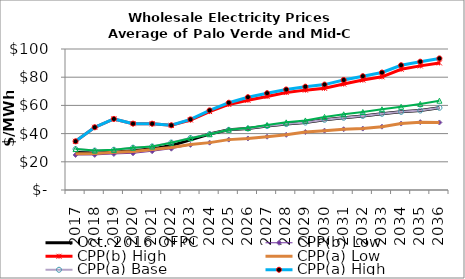
| Category | Oct. 2016 OFPC | CPP(b) Low | CPP(b) High | CPP(a) Low | CPP(a) Base | CPP(a) High | CO2 Price |
|---|---|---|---|---|---|---|---|
| 2017.0 | 26.578 | 24.853 | 34.522 | 25.743 | 29.017 | 34.522 | 29.017 |
| 2018.0 | 26.179 | 24.899 | 44.488 | 25.886 | 27.981 | 44.488 | 27.981 |
| 2019.0 | 26.905 | 25.584 | 50.384 | 26.852 | 28.545 | 50.409 | 28.501 |
| 2020.0 | 27.868 | 26.037 | 47.05 | 27.334 | 30.026 | 47.07 | 29.983 |
| 2021.0 | 29.181 | 27.497 | 46.971 | 28.704 | 30.926 | 47.01 | 30.849 |
| 2022.0 | 31.5 | 29.304 | 45.868 | 30.155 | 33.678 | 45.883 | 33.548 |
| 2023.0 | 35.625 | 31.997 | 49.667 | 32.304 | 36.887 | 50.1 | 36.75 |
| 2024.0 | 39.702 | 33.593 | 55.616 | 33.593 | 39.702 | 56.471 | 39.539 |
| 2025.0 | 42.681 | 35.729 | 60.682 | 35.728 | 42.681 | 61.907 | 42.748 |
| 2026.0 | 43.545 | 36.571 | 63.627 | 36.569 | 43.545 | 65.818 | 43.945 |
| 2027.0 | 45.348 | 37.815 | 66.351 | 37.813 | 45.348 | 68.649 | 46.14 |
| 2028.0 | 46.749 | 39.161 | 69.126 | 39.16 | 46.749 | 71.276 | 47.978 |
| 2029.0 | 47.847 | 41.129 | 70.828 | 41.129 | 47.847 | 73.268 | 49.329 |
| 2030.0 | 49.796 | 42.079 | 72.116 | 42.08 | 49.796 | 74.762 | 51.827 |
| 2031.0 | 51.231 | 43.09 | 75.152 | 43.09 | 51.231 | 78.039 | 53.675 |
| 2032.0 | 52.542 | 43.553 | 77.955 | 43.553 | 52.542 | 80.708 | 55.323 |
| 2033.0 | 54.062 | 44.896 | 80.274 | 44.897 | 54.062 | 83.316 | 57.25 |
| 2034.0 | 55.412 | 47.117 | 85.617 | 47.116 | 55.412 | 88.488 | 59.041 |
| 2035.0 | 56.387 | 48.119 | 88.018 | 48.12 | 56.387 | 91.012 | 61.036 |
| 2036.0 | 58.319 | 47.89 | 90.134 | 47.89 | 58.319 | 93.315 | 63.335 |